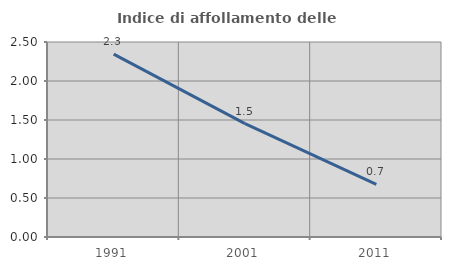
| Category | Indice di affollamento delle abitazioni  |
|---|---|
| 1991.0 | 2.344 |
| 2001.0 | 1.454 |
| 2011.0 | 0.674 |